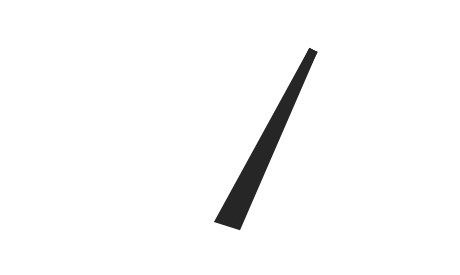
| Category | y |
|---|---|
| 68.4251934976858 | 46.481 |
| 51.8592524280787 | -0.737 |
| 48.1407475719213 | 0.737 |
| 68.4251934976858 | 46.481 |
| 50.0 | 0 |